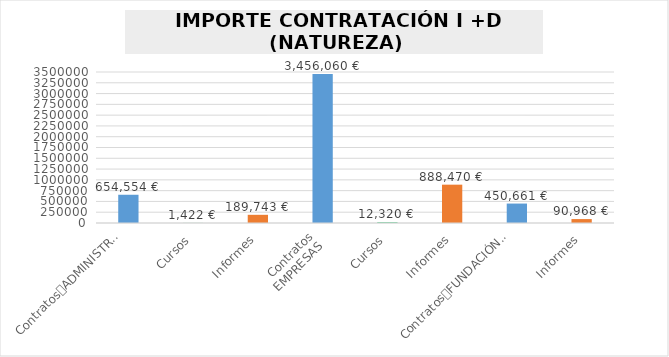
| Category | Series 0 |
|---|---|
| 0 | 654554.49 |
| 1 | 1422 |
| 2 | 189742.68 |
| 3 | 3456060.13 |
| 4 | 12320 |
| 5 | 888469.57 |
| 6 | 450660.84 |
| 7 | 90968.29 |